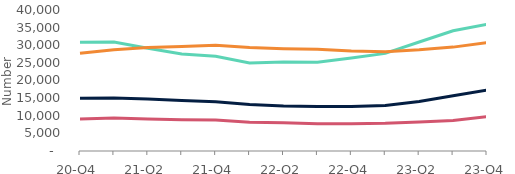
| Category | Arrears of 2.5%-5% of balance | Arrears of 5%-7.5% of balance | Arrears of 7.5%-10% of balance | Arrears over 10% of balance |
|---|---|---|---|---|
| 20-Q4 | 30880 | 14950 | 9060 | 27720 |
| 21-Q1 | 30920 | 15050 | 9340 | 28700 |
| 21-Q2 | 29170 | 14770 | 9070 | 29370 |
| 21-Q3 | 27530 | 14310 | 8870 | 29650 |
| 21-Q4 | 26860 | 13980 | 8790 | 30010 |
| 22-Q1 | 25000 | 13200 | 8150 | 29350 |
| 22-Q2 | 25250 | 12740 | 7980 | 29030 |
| 22-Q3 | 25170 | 12590 | 7760 | 28900 |
| 22-Q4 | 26390 | 12640 | 7750 | 28390 |
| 23-Q1 | 27690 | 12910 | 7840 | 28180 |
| 23-Q2 | 30920 | 14070 | 8200 | 28690 |
| 23-Q3 | 34110 | 15670 | 8680 | 29470 |
| 23-Q4 | 35940 | 17270 | 9720 | 30750 |